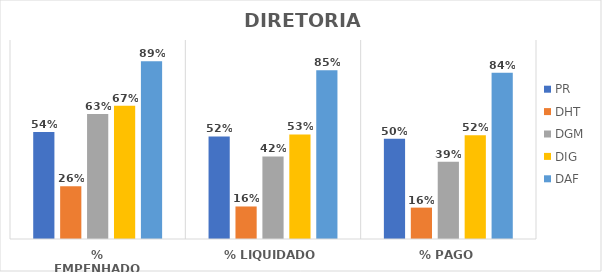
| Category | PR | DHT | DGM | DIG | DAF |
|---|---|---|---|---|---|
| % EMPENHADO | 0.538 | 0.265 | 0.628 | 0.67 | 0.893 |
| % LIQUIDADO | 0.515 | 0.163 | 0.415 | 0.525 | 0.848 |
| % PAGO | 0.504 | 0.158 | 0.388 | 0.522 | 0.835 |